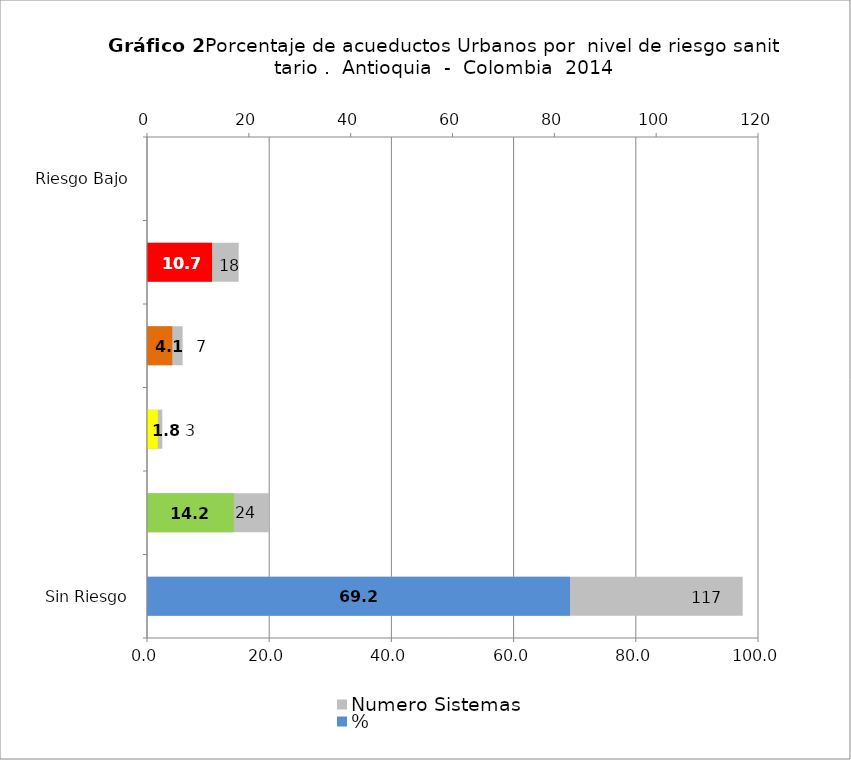
| Category | Numero Sistemas |
|---|---|
| Sin Riesgo | 117 |
| Riesgo Bajo | 24 |
| Riesgo Medio | 3 |
| Riesgo Alto | 7 |
| Inviable Sanitariamente | 18 |
| Sin Dato | 0 |